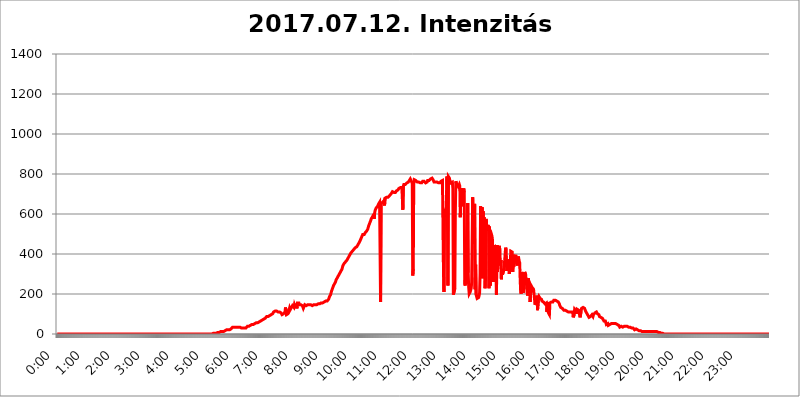
| Category | 2017.07.12. Intenzitás [W/m^2] |
|---|---|
| 0.0 | 0 |
| 0.0006944444444444445 | 0 |
| 0.001388888888888889 | 0 |
| 0.0020833333333333333 | 0 |
| 0.002777777777777778 | 0 |
| 0.003472222222222222 | 0 |
| 0.004166666666666667 | 0 |
| 0.004861111111111111 | 0 |
| 0.005555555555555556 | 0 |
| 0.0062499999999999995 | 0 |
| 0.006944444444444444 | 0 |
| 0.007638888888888889 | 0 |
| 0.008333333333333333 | 0 |
| 0.009027777777777779 | 0 |
| 0.009722222222222222 | 0 |
| 0.010416666666666666 | 0 |
| 0.011111111111111112 | 0 |
| 0.011805555555555555 | 0 |
| 0.012499999999999999 | 0 |
| 0.013194444444444444 | 0 |
| 0.013888888888888888 | 0 |
| 0.014583333333333332 | 0 |
| 0.015277777777777777 | 0 |
| 0.015972222222222224 | 0 |
| 0.016666666666666666 | 0 |
| 0.017361111111111112 | 0 |
| 0.018055555555555557 | 0 |
| 0.01875 | 0 |
| 0.019444444444444445 | 0 |
| 0.02013888888888889 | 0 |
| 0.020833333333333332 | 0 |
| 0.02152777777777778 | 0 |
| 0.022222222222222223 | 0 |
| 0.02291666666666667 | 0 |
| 0.02361111111111111 | 0 |
| 0.024305555555555556 | 0 |
| 0.024999999999999998 | 0 |
| 0.025694444444444447 | 0 |
| 0.02638888888888889 | 0 |
| 0.027083333333333334 | 0 |
| 0.027777777777777776 | 0 |
| 0.02847222222222222 | 0 |
| 0.029166666666666664 | 0 |
| 0.029861111111111113 | 0 |
| 0.030555555555555555 | 0 |
| 0.03125 | 0 |
| 0.03194444444444445 | 0 |
| 0.03263888888888889 | 0 |
| 0.03333333333333333 | 0 |
| 0.034027777777777775 | 0 |
| 0.034722222222222224 | 0 |
| 0.035416666666666666 | 0 |
| 0.036111111111111115 | 0 |
| 0.03680555555555556 | 0 |
| 0.0375 | 0 |
| 0.03819444444444444 | 0 |
| 0.03888888888888889 | 0 |
| 0.03958333333333333 | 0 |
| 0.04027777777777778 | 0 |
| 0.04097222222222222 | 0 |
| 0.041666666666666664 | 0 |
| 0.042361111111111106 | 0 |
| 0.04305555555555556 | 0 |
| 0.043750000000000004 | 0 |
| 0.044444444444444446 | 0 |
| 0.04513888888888889 | 0 |
| 0.04583333333333334 | 0 |
| 0.04652777777777778 | 0 |
| 0.04722222222222222 | 0 |
| 0.04791666666666666 | 0 |
| 0.04861111111111111 | 0 |
| 0.049305555555555554 | 0 |
| 0.049999999999999996 | 0 |
| 0.05069444444444445 | 0 |
| 0.051388888888888894 | 0 |
| 0.052083333333333336 | 0 |
| 0.05277777777777778 | 0 |
| 0.05347222222222222 | 0 |
| 0.05416666666666667 | 0 |
| 0.05486111111111111 | 0 |
| 0.05555555555555555 | 0 |
| 0.05625 | 0 |
| 0.05694444444444444 | 0 |
| 0.057638888888888885 | 0 |
| 0.05833333333333333 | 0 |
| 0.05902777777777778 | 0 |
| 0.059722222222222225 | 0 |
| 0.06041666666666667 | 0 |
| 0.061111111111111116 | 0 |
| 0.06180555555555556 | 0 |
| 0.0625 | 0 |
| 0.06319444444444444 | 0 |
| 0.06388888888888888 | 0 |
| 0.06458333333333334 | 0 |
| 0.06527777777777778 | 0 |
| 0.06597222222222222 | 0 |
| 0.06666666666666667 | 0 |
| 0.06736111111111111 | 0 |
| 0.06805555555555555 | 0 |
| 0.06874999999999999 | 0 |
| 0.06944444444444443 | 0 |
| 0.07013888888888889 | 0 |
| 0.07083333333333333 | 0 |
| 0.07152777777777779 | 0 |
| 0.07222222222222223 | 0 |
| 0.07291666666666667 | 0 |
| 0.07361111111111111 | 0 |
| 0.07430555555555556 | 0 |
| 0.075 | 0 |
| 0.07569444444444444 | 0 |
| 0.0763888888888889 | 0 |
| 0.07708333333333334 | 0 |
| 0.07777777777777778 | 0 |
| 0.07847222222222222 | 0 |
| 0.07916666666666666 | 0 |
| 0.0798611111111111 | 0 |
| 0.08055555555555556 | 0 |
| 0.08125 | 0 |
| 0.08194444444444444 | 0 |
| 0.08263888888888889 | 0 |
| 0.08333333333333333 | 0 |
| 0.08402777777777777 | 0 |
| 0.08472222222222221 | 0 |
| 0.08541666666666665 | 0 |
| 0.08611111111111112 | 0 |
| 0.08680555555555557 | 0 |
| 0.08750000000000001 | 0 |
| 0.08819444444444445 | 0 |
| 0.08888888888888889 | 0 |
| 0.08958333333333333 | 0 |
| 0.09027777777777778 | 0 |
| 0.09097222222222222 | 0 |
| 0.09166666666666667 | 0 |
| 0.09236111111111112 | 0 |
| 0.09305555555555556 | 0 |
| 0.09375 | 0 |
| 0.09444444444444444 | 0 |
| 0.09513888888888888 | 0 |
| 0.09583333333333333 | 0 |
| 0.09652777777777777 | 0 |
| 0.09722222222222222 | 0 |
| 0.09791666666666667 | 0 |
| 0.09861111111111111 | 0 |
| 0.09930555555555555 | 0 |
| 0.09999999999999999 | 0 |
| 0.10069444444444443 | 0 |
| 0.1013888888888889 | 0 |
| 0.10208333333333335 | 0 |
| 0.10277777777777779 | 0 |
| 0.10347222222222223 | 0 |
| 0.10416666666666667 | 0 |
| 0.10486111111111111 | 0 |
| 0.10555555555555556 | 0 |
| 0.10625 | 0 |
| 0.10694444444444444 | 0 |
| 0.1076388888888889 | 0 |
| 0.10833333333333334 | 0 |
| 0.10902777777777778 | 0 |
| 0.10972222222222222 | 0 |
| 0.1111111111111111 | 0 |
| 0.11180555555555556 | 0 |
| 0.11180555555555556 | 0 |
| 0.1125 | 0 |
| 0.11319444444444444 | 0 |
| 0.11388888888888889 | 0 |
| 0.11458333333333333 | 0 |
| 0.11527777777777777 | 0 |
| 0.11597222222222221 | 0 |
| 0.11666666666666665 | 0 |
| 0.1173611111111111 | 0 |
| 0.11805555555555557 | 0 |
| 0.11944444444444445 | 0 |
| 0.12013888888888889 | 0 |
| 0.12083333333333333 | 0 |
| 0.12152777777777778 | 0 |
| 0.12222222222222223 | 0 |
| 0.12291666666666667 | 0 |
| 0.12291666666666667 | 0 |
| 0.12361111111111112 | 0 |
| 0.12430555555555556 | 0 |
| 0.125 | 0 |
| 0.12569444444444444 | 0 |
| 0.12638888888888888 | 0 |
| 0.12708333333333333 | 0 |
| 0.16875 | 0 |
| 0.12847222222222224 | 0 |
| 0.12916666666666668 | 0 |
| 0.12986111111111112 | 0 |
| 0.13055555555555556 | 0 |
| 0.13125 | 0 |
| 0.13194444444444445 | 0 |
| 0.1326388888888889 | 0 |
| 0.13333333333333333 | 0 |
| 0.13402777777777777 | 0 |
| 0.13402777777777777 | 0 |
| 0.13472222222222222 | 0 |
| 0.13541666666666666 | 0 |
| 0.1361111111111111 | 0 |
| 0.13749999999999998 | 0 |
| 0.13819444444444443 | 0 |
| 0.1388888888888889 | 0 |
| 0.13958333333333334 | 0 |
| 0.14027777777777778 | 0 |
| 0.14097222222222222 | 0 |
| 0.14166666666666666 | 0 |
| 0.1423611111111111 | 0 |
| 0.14305555555555557 | 0 |
| 0.14375000000000002 | 0 |
| 0.14444444444444446 | 0 |
| 0.1451388888888889 | 0 |
| 0.1451388888888889 | 0 |
| 0.14652777777777778 | 0 |
| 0.14722222222222223 | 0 |
| 0.14791666666666667 | 0 |
| 0.1486111111111111 | 0 |
| 0.14930555555555555 | 0 |
| 0.15 | 0 |
| 0.15069444444444444 | 0 |
| 0.15138888888888888 | 0 |
| 0.15208333333333332 | 0 |
| 0.15277777777777776 | 0 |
| 0.15347222222222223 | 0 |
| 0.15416666666666667 | 0 |
| 0.15486111111111112 | 0 |
| 0.15555555555555556 | 0 |
| 0.15625 | 0 |
| 0.15694444444444444 | 0 |
| 0.15763888888888888 | 0 |
| 0.15833333333333333 | 0 |
| 0.15902777777777777 | 0 |
| 0.15972222222222224 | 0 |
| 0.16041666666666668 | 0 |
| 0.16111111111111112 | 0 |
| 0.16180555555555556 | 0 |
| 0.1625 | 0 |
| 0.16319444444444445 | 0 |
| 0.1638888888888889 | 0 |
| 0.16458333333333333 | 0 |
| 0.16527777777777777 | 0 |
| 0.16597222222222222 | 0 |
| 0.16666666666666666 | 0 |
| 0.1673611111111111 | 0 |
| 0.16805555555555554 | 0 |
| 0.16874999999999998 | 0 |
| 0.16944444444444443 | 0 |
| 0.17013888888888887 | 0 |
| 0.1708333333333333 | 0 |
| 0.17152777777777775 | 0 |
| 0.17222222222222225 | 0 |
| 0.1729166666666667 | 0 |
| 0.17361111111111113 | 0 |
| 0.17430555555555557 | 0 |
| 0.17500000000000002 | 0 |
| 0.17569444444444446 | 0 |
| 0.1763888888888889 | 0 |
| 0.17708333333333334 | 0 |
| 0.17777777777777778 | 0 |
| 0.17847222222222223 | 0 |
| 0.17916666666666667 | 0 |
| 0.1798611111111111 | 0 |
| 0.18055555555555555 | 0 |
| 0.18125 | 0 |
| 0.18194444444444444 | 0 |
| 0.1826388888888889 | 0 |
| 0.18333333333333335 | 0 |
| 0.1840277777777778 | 0 |
| 0.18472222222222223 | 0 |
| 0.18541666666666667 | 0 |
| 0.18611111111111112 | 0 |
| 0.18680555555555556 | 0 |
| 0.1875 | 0 |
| 0.18819444444444444 | 0 |
| 0.18888888888888888 | 0 |
| 0.18958333333333333 | 0 |
| 0.19027777777777777 | 0 |
| 0.1909722222222222 | 0 |
| 0.19166666666666665 | 0 |
| 0.19236111111111112 | 0 |
| 0.19305555555555554 | 0 |
| 0.19375 | 0 |
| 0.19444444444444445 | 0 |
| 0.1951388888888889 | 0 |
| 0.19583333333333333 | 0 |
| 0.19652777777777777 | 0 |
| 0.19722222222222222 | 0 |
| 0.19791666666666666 | 0 |
| 0.1986111111111111 | 0 |
| 0.19930555555555554 | 0 |
| 0.19999999999999998 | 0 |
| 0.20069444444444443 | 0 |
| 0.20138888888888887 | 0 |
| 0.2020833333333333 | 0 |
| 0.2027777777777778 | 0 |
| 0.2034722222222222 | 0 |
| 0.2041666666666667 | 0 |
| 0.20486111111111113 | 0 |
| 0.20555555555555557 | 0 |
| 0.20625000000000002 | 0 |
| 0.20694444444444446 | 0 |
| 0.2076388888888889 | 0 |
| 0.20833333333333334 | 0 |
| 0.20902777777777778 | 0 |
| 0.20972222222222223 | 0 |
| 0.21041666666666667 | 0 |
| 0.2111111111111111 | 0 |
| 0.21180555555555555 | 0 |
| 0.2125 | 0 |
| 0.21319444444444444 | 0 |
| 0.2138888888888889 | 0 |
| 0.21458333333333335 | 0 |
| 0.2152777777777778 | 0 |
| 0.21597222222222223 | 0 |
| 0.21666666666666667 | 0 |
| 0.21736111111111112 | 0 |
| 0.21805555555555556 | 3.525 |
| 0.21875 | 3.525 |
| 0.21944444444444444 | 3.525 |
| 0.22013888888888888 | 3.525 |
| 0.22083333333333333 | 3.525 |
| 0.22152777777777777 | 3.525 |
| 0.2222222222222222 | 3.525 |
| 0.22291666666666665 | 3.525 |
| 0.2236111111111111 | 7.887 |
| 0.22430555555555556 | 7.887 |
| 0.225 | 7.887 |
| 0.22569444444444445 | 7.887 |
| 0.2263888888888889 | 7.887 |
| 0.22708333333333333 | 7.887 |
| 0.22777777777777777 | 7.887 |
| 0.22847222222222222 | 7.887 |
| 0.22916666666666666 | 12.257 |
| 0.2298611111111111 | 12.257 |
| 0.23055555555555554 | 12.257 |
| 0.23124999999999998 | 12.257 |
| 0.23194444444444443 | 12.257 |
| 0.23263888888888887 | 12.257 |
| 0.2333333333333333 | 12.257 |
| 0.2340277777777778 | 16.636 |
| 0.2347222222222222 | 16.636 |
| 0.2354166666666667 | 16.636 |
| 0.23611111111111113 | 16.636 |
| 0.23680555555555557 | 16.636 |
| 0.23750000000000002 | 21.024 |
| 0.23819444444444446 | 21.024 |
| 0.2388888888888889 | 21.024 |
| 0.23958333333333334 | 21.024 |
| 0.24027777777777778 | 21.024 |
| 0.24097222222222223 | 21.024 |
| 0.24166666666666667 | 21.024 |
| 0.2423611111111111 | 25.419 |
| 0.24305555555555555 | 25.419 |
| 0.24375 | 25.419 |
| 0.24444444444444446 | 29.823 |
| 0.24513888888888888 | 29.823 |
| 0.24583333333333335 | 34.234 |
| 0.2465277777777778 | 34.234 |
| 0.24722222222222223 | 34.234 |
| 0.24791666666666667 | 34.234 |
| 0.24861111111111112 | 34.234 |
| 0.24930555555555556 | 34.234 |
| 0.25 | 34.234 |
| 0.25069444444444444 | 34.234 |
| 0.2513888888888889 | 34.234 |
| 0.2520833333333333 | 34.234 |
| 0.25277777777777777 | 34.234 |
| 0.2534722222222222 | 34.234 |
| 0.25416666666666665 | 34.234 |
| 0.2548611111111111 | 34.234 |
| 0.2555555555555556 | 34.234 |
| 0.25625000000000003 | 34.234 |
| 0.2569444444444445 | 34.234 |
| 0.2576388888888889 | 29.823 |
| 0.25833333333333336 | 29.823 |
| 0.2590277777777778 | 29.823 |
| 0.25972222222222224 | 29.823 |
| 0.2604166666666667 | 29.823 |
| 0.2611111111111111 | 29.823 |
| 0.26180555555555557 | 29.823 |
| 0.2625 | 29.823 |
| 0.26319444444444445 | 29.823 |
| 0.2638888888888889 | 29.823 |
| 0.26458333333333334 | 29.823 |
| 0.2652777777777778 | 34.234 |
| 0.2659722222222222 | 34.234 |
| 0.26666666666666666 | 38.653 |
| 0.2673611111111111 | 38.653 |
| 0.26805555555555555 | 38.653 |
| 0.26875 | 38.653 |
| 0.26944444444444443 | 43.079 |
| 0.2701388888888889 | 43.079 |
| 0.2708333333333333 | 43.079 |
| 0.27152777777777776 | 43.079 |
| 0.2722222222222222 | 47.511 |
| 0.27291666666666664 | 47.511 |
| 0.2736111111111111 | 47.511 |
| 0.2743055555555555 | 47.511 |
| 0.27499999999999997 | 47.511 |
| 0.27569444444444446 | 47.511 |
| 0.27638888888888885 | 51.951 |
| 0.27708333333333335 | 51.951 |
| 0.2777777777777778 | 51.951 |
| 0.27847222222222223 | 51.951 |
| 0.2791666666666667 | 56.398 |
| 0.2798611111111111 | 56.398 |
| 0.28055555555555556 | 56.398 |
| 0.28125 | 56.398 |
| 0.28194444444444444 | 56.398 |
| 0.2826388888888889 | 56.398 |
| 0.2833333333333333 | 60.85 |
| 0.28402777777777777 | 60.85 |
| 0.2847222222222222 | 65.31 |
| 0.28541666666666665 | 65.31 |
| 0.28611111111111115 | 65.31 |
| 0.28680555555555554 | 69.775 |
| 0.28750000000000003 | 69.775 |
| 0.2881944444444445 | 69.775 |
| 0.2888888888888889 | 74.246 |
| 0.28958333333333336 | 74.246 |
| 0.2902777777777778 | 74.246 |
| 0.29097222222222224 | 78.722 |
| 0.2916666666666667 | 78.722 |
| 0.2923611111111111 | 83.205 |
| 0.29305555555555557 | 83.205 |
| 0.29375 | 87.692 |
| 0.29444444444444445 | 87.692 |
| 0.2951388888888889 | 87.692 |
| 0.29583333333333334 | 87.692 |
| 0.2965277777777778 | 87.692 |
| 0.2972222222222222 | 92.184 |
| 0.29791666666666666 | 92.184 |
| 0.2986111111111111 | 96.682 |
| 0.29930555555555555 | 96.682 |
| 0.3 | 96.682 |
| 0.30069444444444443 | 101.184 |
| 0.3013888888888889 | 101.184 |
| 0.3020833333333333 | 101.184 |
| 0.30277777777777776 | 105.69 |
| 0.3034722222222222 | 110.201 |
| 0.30416666666666664 | 114.716 |
| 0.3048611111111111 | 114.716 |
| 0.3055555555555555 | 114.716 |
| 0.30624999999999997 | 114.716 |
| 0.3069444444444444 | 114.716 |
| 0.3076388888888889 | 114.716 |
| 0.30833333333333335 | 110.201 |
| 0.3090277777777778 | 110.201 |
| 0.30972222222222223 | 110.201 |
| 0.3104166666666667 | 110.201 |
| 0.3111111111111111 | 110.201 |
| 0.31180555555555556 | 110.201 |
| 0.3125 | 110.201 |
| 0.31319444444444444 | 110.201 |
| 0.3138888888888889 | 105.69 |
| 0.3145833333333333 | 101.184 |
| 0.31527777777777777 | 96.682 |
| 0.3159722222222222 | 96.682 |
| 0.31666666666666665 | 96.682 |
| 0.31736111111111115 | 101.184 |
| 0.31805555555555554 | 96.682 |
| 0.31875000000000003 | 105.69 |
| 0.3194444444444445 | 110.201 |
| 0.3201388888888889 | 132.814 |
| 0.32083333333333336 | 119.235 |
| 0.3215277777777778 | 96.682 |
| 0.32222222222222224 | 96.682 |
| 0.3229166666666667 | 101.184 |
| 0.3236111111111111 | 101.184 |
| 0.32430555555555557 | 101.184 |
| 0.325 | 105.69 |
| 0.32569444444444445 | 128.284 |
| 0.3263888888888889 | 119.235 |
| 0.32708333333333334 | 119.235 |
| 0.3277777777777778 | 119.235 |
| 0.3284722222222222 | 132.814 |
| 0.32916666666666666 | 137.347 |
| 0.3298611111111111 | 141.884 |
| 0.33055555555555555 | 141.884 |
| 0.33125 | 141.884 |
| 0.33194444444444443 | 132.814 |
| 0.3326388888888889 | 146.423 |
| 0.3333333333333333 | 150.964 |
| 0.3340277777777778 | 132.814 |
| 0.3347222222222222 | 150.964 |
| 0.3354166666666667 | 155.509 |
| 0.3361111111111111 | 128.284 |
| 0.3368055555555556 | 155.509 |
| 0.33749999999999997 | 155.509 |
| 0.33819444444444446 | 150.964 |
| 0.33888888888888885 | 155.509 |
| 0.33958333333333335 | 146.423 |
| 0.34027777777777773 | 146.423 |
| 0.34097222222222223 | 146.423 |
| 0.3416666666666666 | 146.423 |
| 0.3423611111111111 | 141.884 |
| 0.3430555555555555 | 141.884 |
| 0.34375 | 141.884 |
| 0.3444444444444445 | 141.884 |
| 0.3451388888888889 | 128.284 |
| 0.3458333333333334 | 123.758 |
| 0.34652777777777777 | 128.284 |
| 0.34722222222222227 | 146.423 |
| 0.34791666666666665 | 146.423 |
| 0.34861111111111115 | 141.884 |
| 0.34930555555555554 | 141.884 |
| 0.35000000000000003 | 137.347 |
| 0.3506944444444444 | 141.884 |
| 0.3513888888888889 | 146.423 |
| 0.3520833333333333 | 146.423 |
| 0.3527777777777778 | 146.423 |
| 0.3534722222222222 | 146.423 |
| 0.3541666666666667 | 146.423 |
| 0.3548611111111111 | 146.423 |
| 0.35555555555555557 | 146.423 |
| 0.35625 | 141.884 |
| 0.35694444444444445 | 141.884 |
| 0.3576388888888889 | 141.884 |
| 0.35833333333333334 | 146.423 |
| 0.3590277777777778 | 141.884 |
| 0.3597222222222222 | 146.423 |
| 0.36041666666666666 | 146.423 |
| 0.3611111111111111 | 146.423 |
| 0.36180555555555555 | 146.423 |
| 0.3625 | 146.423 |
| 0.36319444444444443 | 146.423 |
| 0.3638888888888889 | 146.423 |
| 0.3645833333333333 | 146.423 |
| 0.3652777777777778 | 150.964 |
| 0.3659722222222222 | 150.964 |
| 0.3666666666666667 | 150.964 |
| 0.3673611111111111 | 150.964 |
| 0.3680555555555556 | 150.964 |
| 0.36874999999999997 | 155.509 |
| 0.36944444444444446 | 155.509 |
| 0.37013888888888885 | 155.509 |
| 0.37083333333333335 | 155.509 |
| 0.37152777777777773 | 155.509 |
| 0.37222222222222223 | 155.509 |
| 0.3729166666666666 | 160.056 |
| 0.3736111111111111 | 160.056 |
| 0.3743055555555555 | 160.056 |
| 0.375 | 160.056 |
| 0.3756944444444445 | 160.056 |
| 0.3763888888888889 | 164.605 |
| 0.3770833333333334 | 164.605 |
| 0.37777777777777777 | 164.605 |
| 0.37847222222222227 | 164.605 |
| 0.37916666666666665 | 164.605 |
| 0.37986111111111115 | 164.605 |
| 0.38055555555555554 | 173.709 |
| 0.38125000000000003 | 178.264 |
| 0.3819444444444444 | 187.378 |
| 0.3826388888888889 | 191.937 |
| 0.3833333333333333 | 196.497 |
| 0.3840277777777778 | 205.62 |
| 0.3847222222222222 | 214.746 |
| 0.3854166666666667 | 219.309 |
| 0.3861111111111111 | 228.436 |
| 0.38680555555555557 | 233 |
| 0.3875 | 242.127 |
| 0.38819444444444445 | 246.689 |
| 0.3888888888888889 | 251.251 |
| 0.38958333333333334 | 255.813 |
| 0.3902777777777778 | 260.373 |
| 0.3909722222222222 | 269.49 |
| 0.39166666666666666 | 274.047 |
| 0.3923611111111111 | 278.603 |
| 0.39305555555555555 | 278.603 |
| 0.39375 | 287.709 |
| 0.39444444444444443 | 287.709 |
| 0.3951388888888889 | 296.808 |
| 0.3958333333333333 | 301.354 |
| 0.3965277777777778 | 305.898 |
| 0.3972222222222222 | 310.44 |
| 0.3979166666666667 | 314.98 |
| 0.3986111111111111 | 319.517 |
| 0.3993055555555556 | 324.052 |
| 0.39999999999999997 | 333.113 |
| 0.40069444444444446 | 342.162 |
| 0.40138888888888885 | 346.682 |
| 0.40208333333333335 | 351.198 |
| 0.40277777777777773 | 351.198 |
| 0.40347222222222223 | 355.712 |
| 0.4041666666666666 | 360.221 |
| 0.4048611111111111 | 360.221 |
| 0.4055555555555555 | 364.728 |
| 0.40625 | 369.23 |
| 0.4069444444444445 | 373.729 |
| 0.4076388888888889 | 378.224 |
| 0.4083333333333334 | 382.715 |
| 0.40902777777777777 | 387.202 |
| 0.40972222222222227 | 391.685 |
| 0.41041666666666665 | 396.164 |
| 0.41111111111111115 | 400.638 |
| 0.41180555555555554 | 405.108 |
| 0.41250000000000003 | 405.108 |
| 0.4131944444444444 | 409.574 |
| 0.4138888888888889 | 414.035 |
| 0.4145833333333333 | 418.492 |
| 0.4152777777777778 | 418.492 |
| 0.4159722222222222 | 422.943 |
| 0.4166666666666667 | 422.943 |
| 0.4173611111111111 | 427.39 |
| 0.41805555555555557 | 431.833 |
| 0.41875 | 431.833 |
| 0.41944444444444445 | 431.833 |
| 0.4201388888888889 | 436.27 |
| 0.42083333333333334 | 440.702 |
| 0.4215277777777778 | 445.129 |
| 0.4222222222222222 | 449.551 |
| 0.42291666666666666 | 453.968 |
| 0.4236111111111111 | 453.968 |
| 0.42430555555555555 | 462.786 |
| 0.425 | 467.187 |
| 0.42569444444444443 | 467.187 |
| 0.4263888888888889 | 480.356 |
| 0.4270833333333333 | 480.356 |
| 0.4277777777777778 | 484.735 |
| 0.4284722222222222 | 497.836 |
| 0.4291666666666667 | 497.836 |
| 0.4298611111111111 | 497.836 |
| 0.4305555555555556 | 497.836 |
| 0.43124999999999997 | 502.192 |
| 0.43194444444444446 | 506.542 |
| 0.43263888888888885 | 510.885 |
| 0.43333333333333335 | 502.192 |
| 0.43402777777777773 | 515.223 |
| 0.43472222222222223 | 515.223 |
| 0.4354166666666666 | 523.88 |
| 0.4361111111111111 | 532.513 |
| 0.4368055555555555 | 541.121 |
| 0.4375 | 545.416 |
| 0.4381944444444445 | 553.986 |
| 0.4388888888888889 | 558.261 |
| 0.4395833333333334 | 566.793 |
| 0.44027777777777777 | 575.299 |
| 0.44097222222222227 | 571.049 |
| 0.44166666666666665 | 583.779 |
| 0.44236111111111115 | 588.009 |
| 0.44305555555555554 | 592.233 |
| 0.44375000000000003 | 600.661 |
| 0.4444444444444444 | 575.299 |
| 0.4451388888888889 | 604.864 |
| 0.4458333333333333 | 617.436 |
| 0.4465277777777778 | 621.613 |
| 0.4472222222222222 | 629.948 |
| 0.4479166666666667 | 629.948 |
| 0.4486111111111111 | 634.105 |
| 0.44930555555555557 | 638.256 |
| 0.45 | 642.4 |
| 0.45069444444444445 | 650.667 |
| 0.4513888888888889 | 654.791 |
| 0.45208333333333334 | 658.909 |
| 0.4527777777777778 | 658.909 |
| 0.4534722222222222 | 160.056 |
| 0.45416666666666666 | 654.791 |
| 0.4548611111111111 | 654.791 |
| 0.45555555555555555 | 658.909 |
| 0.45625 | 658.909 |
| 0.45694444444444443 | 658.909 |
| 0.4576388888888889 | 663.019 |
| 0.4583333333333333 | 667.123 |
| 0.4590277777777778 | 642.4 |
| 0.4597222222222222 | 679.395 |
| 0.4604166666666667 | 679.395 |
| 0.4611111111111111 | 679.395 |
| 0.4618055555555556 | 683.473 |
| 0.46249999999999997 | 683.473 |
| 0.46319444444444446 | 683.473 |
| 0.46388888888888885 | 683.473 |
| 0.46458333333333335 | 683.473 |
| 0.46527777777777773 | 687.544 |
| 0.46597222222222223 | 691.608 |
| 0.4666666666666666 | 691.608 |
| 0.4673611111111111 | 695.666 |
| 0.4680555555555555 | 699.717 |
| 0.46875 | 703.762 |
| 0.4694444444444445 | 703.762 |
| 0.4701388888888889 | 711.832 |
| 0.4708333333333334 | 707.8 |
| 0.47152777777777777 | 707.8 |
| 0.47222222222222227 | 707.8 |
| 0.47291666666666665 | 703.762 |
| 0.47361111111111115 | 707.8 |
| 0.47430555555555554 | 707.8 |
| 0.47500000000000003 | 711.832 |
| 0.4756944444444444 | 715.858 |
| 0.4763888888888889 | 715.858 |
| 0.4770833333333333 | 715.858 |
| 0.4777777777777778 | 719.877 |
| 0.4784722222222222 | 719.877 |
| 0.4791666666666667 | 727.896 |
| 0.4798611111111111 | 727.896 |
| 0.48055555555555557 | 727.896 |
| 0.48125 | 731.896 |
| 0.48194444444444445 | 735.89 |
| 0.4826388888888889 | 727.896 |
| 0.48333333333333334 | 731.896 |
| 0.4840277777777778 | 731.896 |
| 0.4847222222222222 | 621.613 |
| 0.48541666666666666 | 739.877 |
| 0.4861111111111111 | 747.834 |
| 0.48680555555555555 | 747.834 |
| 0.4875 | 743.859 |
| 0.48819444444444443 | 747.834 |
| 0.4888888888888889 | 747.834 |
| 0.4895833333333333 | 751.803 |
| 0.4902777777777778 | 755.766 |
| 0.4909722222222222 | 755.766 |
| 0.4916666666666667 | 759.723 |
| 0.4923611111111111 | 759.723 |
| 0.4930555555555556 | 763.674 |
| 0.49374999999999997 | 767.62 |
| 0.49444444444444446 | 771.559 |
| 0.49513888888888885 | 775.492 |
| 0.49583333333333335 | 771.559 |
| 0.49652777777777773 | 771.559 |
| 0.49722222222222223 | 759.723 |
| 0.4979166666666666 | 751.803 |
| 0.4986111111111111 | 292.259 |
| 0.4993055555555555 | 324.052 |
| 0.5 | 747.834 |
| 0.5006944444444444 | 771.559 |
| 0.5013888888888889 | 767.62 |
| 0.5020833333333333 | 767.62 |
| 0.5027777777777778 | 767.62 |
| 0.5034722222222222 | 763.674 |
| 0.5041666666666667 | 763.674 |
| 0.5048611111111111 | 759.723 |
| 0.5055555555555555 | 763.674 |
| 0.50625 | 759.723 |
| 0.5069444444444444 | 759.723 |
| 0.5076388888888889 | 759.723 |
| 0.5083333333333333 | 755.766 |
| 0.5090277777777777 | 755.766 |
| 0.5097222222222222 | 759.723 |
| 0.5104166666666666 | 751.803 |
| 0.5111111111111112 | 755.766 |
| 0.5118055555555555 | 759.723 |
| 0.5125000000000001 | 763.674 |
| 0.5131944444444444 | 767.62 |
| 0.513888888888889 | 767.62 |
| 0.5145833333333333 | 763.674 |
| 0.5152777777777778 | 763.674 |
| 0.5159722222222222 | 759.723 |
| 0.5166666666666667 | 755.766 |
| 0.517361111111111 | 759.723 |
| 0.5180555555555556 | 759.723 |
| 0.5187499999999999 | 759.723 |
| 0.5194444444444445 | 767.62 |
| 0.5201388888888888 | 767.62 |
| 0.5208333333333334 | 767.62 |
| 0.5215277777777778 | 767.62 |
| 0.5222222222222223 | 767.62 |
| 0.5229166666666667 | 767.62 |
| 0.5236111111111111 | 775.492 |
| 0.5243055555555556 | 775.492 |
| 0.525 | 775.492 |
| 0.5256944444444445 | 779.42 |
| 0.5263888888888889 | 775.492 |
| 0.5270833333333333 | 771.559 |
| 0.5277777777777778 | 767.62 |
| 0.5284722222222222 | 759.723 |
| 0.5291666666666667 | 759.723 |
| 0.5298611111111111 | 759.723 |
| 0.5305555555555556 | 759.723 |
| 0.53125 | 759.723 |
| 0.5319444444444444 | 759.723 |
| 0.5326388888888889 | 759.723 |
| 0.5333333333333333 | 755.766 |
| 0.5340277777777778 | 755.766 |
| 0.5347222222222222 | 755.766 |
| 0.5354166666666667 | 751.803 |
| 0.5361111111111111 | 755.766 |
| 0.5368055555555555 | 755.766 |
| 0.5375 | 759.723 |
| 0.5381944444444444 | 763.674 |
| 0.5388888888888889 | 767.62 |
| 0.5395833333333333 | 763.674 |
| 0.5402777777777777 | 767.62 |
| 0.5409722222222222 | 767.62 |
| 0.5416666666666666 | 324.052 |
| 0.5423611111111112 | 210.182 |
| 0.5430555555555555 | 600.661 |
| 0.5437500000000001 | 625.784 |
| 0.5444444444444444 | 583.779 |
| 0.545138888888889 | 609.062 |
| 0.5458333333333333 | 671.22 |
| 0.5465277777777778 | 787.258 |
| 0.5472222222222222 | 600.661 |
| 0.5479166666666667 | 242.127 |
| 0.548611111111111 | 787.258 |
| 0.5493055555555556 | 783.342 |
| 0.5499999999999999 | 779.42 |
| 0.5506944444444445 | 767.62 |
| 0.5513888888888888 | 767.62 |
| 0.5520833333333334 | 755.766 |
| 0.5527777777777778 | 755.766 |
| 0.5534722222222223 | 759.723 |
| 0.5541666666666667 | 759.723 |
| 0.5548611111111111 | 727.896 |
| 0.5555555555555556 | 196.497 |
| 0.55625 | 191.937 |
| 0.5569444444444445 | 201.058 |
| 0.5576388888888889 | 228.436 |
| 0.5583333333333333 | 609.062 |
| 0.5590277777777778 | 763.674 |
| 0.5597222222222222 | 755.766 |
| 0.5604166666666667 | 755.766 |
| 0.5611111111111111 | 743.859 |
| 0.5618055555555556 | 739.877 |
| 0.5625 | 735.89 |
| 0.5631944444444444 | 739.877 |
| 0.5638888888888889 | 747.834 |
| 0.5645833333333333 | 739.877 |
| 0.5652777777777778 | 583.779 |
| 0.5659722222222222 | 695.666 |
| 0.5666666666666667 | 727.896 |
| 0.5673611111111111 | 719.877 |
| 0.5680555555555555 | 727.896 |
| 0.56875 | 638.256 |
| 0.5694444444444444 | 715.858 |
| 0.5701388888888889 | 727.896 |
| 0.5708333333333333 | 707.8 |
| 0.5715277777777777 | 251.251 |
| 0.5722222222222222 | 242.127 |
| 0.5729166666666666 | 342.162 |
| 0.5736111111111112 | 260.373 |
| 0.5743055555555555 | 251.251 |
| 0.5750000000000001 | 342.162 |
| 0.5756944444444444 | 654.791 |
| 0.576388888888889 | 305.898 |
| 0.5770833333333333 | 233 |
| 0.5777777777777778 | 201.058 |
| 0.5784722222222222 | 205.62 |
| 0.5791666666666667 | 210.182 |
| 0.579861111111111 | 214.746 |
| 0.5805555555555556 | 228.436 |
| 0.5812499999999999 | 255.813 |
| 0.5819444444444445 | 255.813 |
| 0.5826388888888888 | 683.473 |
| 0.5833333333333334 | 683.473 |
| 0.5840277777777778 | 449.551 |
| 0.5847222222222223 | 497.836 |
| 0.5854166666666667 | 650.667 |
| 0.5861111111111111 | 223.873 |
| 0.5868055555555556 | 346.682 |
| 0.5875 | 196.497 |
| 0.5881944444444445 | 191.937 |
| 0.5888888888888889 | 178.264 |
| 0.5895833333333333 | 173.709 |
| 0.5902777777777778 | 182.82 |
| 0.5909722222222222 | 182.82 |
| 0.5916666666666667 | 191.937 |
| 0.5923611111111111 | 205.62 |
| 0.5930555555555556 | 301.354 |
| 0.59375 | 638.256 |
| 0.5944444444444444 | 287.709 |
| 0.5951388888888889 | 283.156 |
| 0.5958333333333333 | 634.105 |
| 0.5965277777777778 | 278.603 |
| 0.5972222222222222 | 613.252 |
| 0.5979166666666667 | 337.639 |
| 0.5986111111111111 | 583.779 |
| 0.5993055555555555 | 328.584 |
| 0.6 | 228.436 |
| 0.6006944444444444 | 283.156 |
| 0.6013888888888889 | 575.299 |
| 0.6020833333333333 | 558.261 |
| 0.6027777777777777 | 515.223 |
| 0.6034722222222222 | 528.2 |
| 0.6041666666666666 | 545.416 |
| 0.6048611111111112 | 532.513 |
| 0.6055555555555555 | 228.436 |
| 0.6062500000000001 | 536.82 |
| 0.6069444444444444 | 242.127 |
| 0.607638888888889 | 251.251 |
| 0.6083333333333333 | 489.108 |
| 0.6090277777777778 | 497.836 |
| 0.6097222222222222 | 489.108 |
| 0.6104166666666667 | 471.582 |
| 0.611111111111111 | 467.187 |
| 0.6118055555555556 | 260.373 |
| 0.6124999999999999 | 355.712 |
| 0.6131944444444445 | 445.129 |
| 0.6138888888888888 | 440.702 |
| 0.6145833333333334 | 431.833 |
| 0.6152777777777778 | 431.833 |
| 0.6159722222222223 | 196.497 |
| 0.6166666666666667 | 445.129 |
| 0.6173611111111111 | 310.44 |
| 0.6180555555555556 | 431.833 |
| 0.61875 | 436.27 |
| 0.6194444444444445 | 409.574 |
| 0.6201388888888889 | 440.702 |
| 0.6208333333333333 | 414.035 |
| 0.6215277777777778 | 342.162 |
| 0.6222222222222222 | 369.23 |
| 0.6229166666666667 | 274.047 |
| 0.6236111111111111 | 324.052 |
| 0.6243055555555556 | 296.808 |
| 0.625 | 292.259 |
| 0.6256944444444444 | 310.44 |
| 0.6263888888888889 | 328.584 |
| 0.6270833333333333 | 346.682 |
| 0.6277777777777778 | 342.162 |
| 0.6284722222222222 | 414.035 |
| 0.6291666666666667 | 431.833 |
| 0.6298611111111111 | 360.221 |
| 0.6305555555555555 | 314.98 |
| 0.63125 | 373.729 |
| 0.6319444444444444 | 346.682 |
| 0.6326388888888889 | 319.517 |
| 0.6333333333333333 | 360.221 |
| 0.6340277777777777 | 301.354 |
| 0.6347222222222222 | 305.898 |
| 0.6354166666666666 | 355.712 |
| 0.6361111111111112 | 414.035 |
| 0.6368055555555555 | 409.574 |
| 0.6375000000000001 | 409.574 |
| 0.6381944444444444 | 409.574 |
| 0.638888888888889 | 310.44 |
| 0.6395833333333333 | 396.164 |
| 0.6402777777777778 | 337.639 |
| 0.6409722222222222 | 337.639 |
| 0.6416666666666667 | 373.729 |
| 0.642361111111111 | 378.224 |
| 0.6430555555555556 | 396.164 |
| 0.6437499999999999 | 369.23 |
| 0.6444444444444445 | 355.712 |
| 0.6451388888888888 | 355.712 |
| 0.6458333333333334 | 342.162 |
| 0.6465277777777778 | 387.202 |
| 0.6472222222222223 | 378.224 |
| 0.6479166666666667 | 364.728 |
| 0.6486111111111111 | 355.712 |
| 0.6493055555555556 | 269.49 |
| 0.65 | 210.182 |
| 0.6506944444444445 | 201.058 |
| 0.6513888888888889 | 310.44 |
| 0.6520833333333333 | 310.44 |
| 0.6527777777777778 | 310.44 |
| 0.6534722222222222 | 205.62 |
| 0.6541666666666667 | 219.309 |
| 0.6548611111111111 | 228.436 |
| 0.6555555555555556 | 310.44 |
| 0.65625 | 305.898 |
| 0.6569444444444444 | 296.808 |
| 0.6576388888888889 | 296.808 |
| 0.6583333333333333 | 242.127 |
| 0.6590277777777778 | 205.62 |
| 0.6597222222222222 | 191.937 |
| 0.6604166666666667 | 278.603 |
| 0.6611111111111111 | 269.49 |
| 0.6618055555555555 | 269.49 |
| 0.6625 | 237.564 |
| 0.6631944444444444 | 160.056 |
| 0.6638888888888889 | 164.605 |
| 0.6645833333333333 | 242.127 |
| 0.6652777777777777 | 242.127 |
| 0.6659722222222222 | 233 |
| 0.6666666666666666 | 233 |
| 0.6673611111111111 | 228.436 |
| 0.6680555555555556 | 223.873 |
| 0.6687500000000001 | 219.309 |
| 0.6694444444444444 | 219.309 |
| 0.6701388888888888 | 146.423 |
| 0.6708333333333334 | 141.884 |
| 0.6715277777777778 | 164.605 |
| 0.6722222222222222 | 160.056 |
| 0.6729166666666666 | 191.937 |
| 0.6736111111111112 | 119.235 |
| 0.6743055555555556 | 119.235 |
| 0.6749999999999999 | 178.264 |
| 0.6756944444444444 | 187.378 |
| 0.6763888888888889 | 182.82 |
| 0.6770833333333334 | 178.264 |
| 0.6777777777777777 | 178.264 |
| 0.6784722222222223 | 173.709 |
| 0.6791666666666667 | 173.709 |
| 0.6798611111111111 | 164.605 |
| 0.6805555555555555 | 164.605 |
| 0.68125 | 164.605 |
| 0.6819444444444445 | 160.056 |
| 0.6826388888888889 | 160.056 |
| 0.6833333333333332 | 155.509 |
| 0.6840277777777778 | 150.964 |
| 0.6847222222222222 | 150.964 |
| 0.6854166666666667 | 155.509 |
| 0.686111111111111 | 155.509 |
| 0.6868055555555556 | 110.201 |
| 0.6875 | 160.056 |
| 0.6881944444444444 | 155.509 |
| 0.688888888888889 | 105.69 |
| 0.6895833333333333 | 101.184 |
| 0.6902777777777778 | 96.682 |
| 0.6909722222222222 | 155.509 |
| 0.6916666666666668 | 160.056 |
| 0.6923611111111111 | 160.056 |
| 0.6930555555555555 | 160.056 |
| 0.69375 | 160.056 |
| 0.6944444444444445 | 160.056 |
| 0.6951388888888889 | 160.056 |
| 0.6958333333333333 | 164.605 |
| 0.6965277777777777 | 169.156 |
| 0.6972222222222223 | 169.156 |
| 0.6979166666666666 | 169.156 |
| 0.6986111111111111 | 169.156 |
| 0.6993055555555556 | 164.605 |
| 0.7000000000000001 | 164.605 |
| 0.7006944444444444 | 164.605 |
| 0.7013888888888888 | 164.605 |
| 0.7020833333333334 | 164.605 |
| 0.7027777777777778 | 160.056 |
| 0.7034722222222222 | 155.509 |
| 0.7041666666666666 | 150.964 |
| 0.7048611111111112 | 141.884 |
| 0.7055555555555556 | 137.347 |
| 0.7062499999999999 | 132.814 |
| 0.7069444444444444 | 132.814 |
| 0.7076388888888889 | 128.284 |
| 0.7083333333333334 | 128.284 |
| 0.7090277777777777 | 128.284 |
| 0.7097222222222223 | 123.758 |
| 0.7104166666666667 | 119.235 |
| 0.7111111111111111 | 119.235 |
| 0.7118055555555555 | 119.235 |
| 0.7125 | 119.235 |
| 0.7131944444444445 | 114.716 |
| 0.7138888888888889 | 114.716 |
| 0.7145833333333332 | 114.716 |
| 0.7152777777777778 | 110.201 |
| 0.7159722222222222 | 110.201 |
| 0.7166666666666667 | 110.201 |
| 0.717361111111111 | 110.201 |
| 0.7180555555555556 | 110.201 |
| 0.71875 | 110.201 |
| 0.7194444444444444 | 110.201 |
| 0.720138888888889 | 110.201 |
| 0.7208333333333333 | 110.201 |
| 0.7215277777777778 | 114.716 |
| 0.7222222222222222 | 114.716 |
| 0.7229166666666668 | 110.201 |
| 0.7236111111111111 | 83.205 |
| 0.7243055555555555 | 83.205 |
| 0.725 | 96.682 |
| 0.7256944444444445 | 123.758 |
| 0.7263888888888889 | 128.284 |
| 0.7270833333333333 | 123.758 |
| 0.7277777777777777 | 114.716 |
| 0.7284722222222223 | 101.184 |
| 0.7291666666666666 | 123.758 |
| 0.7298611111111111 | 128.284 |
| 0.7305555555555556 | 123.758 |
| 0.7312500000000001 | 119.235 |
| 0.7319444444444444 | 105.69 |
| 0.7326388888888888 | 105.69 |
| 0.7333333333333334 | 83.205 |
| 0.7340277777777778 | 87.692 |
| 0.7347222222222222 | 114.716 |
| 0.7354166666666666 | 128.284 |
| 0.7361111111111112 | 132.814 |
| 0.7368055555555556 | 128.284 |
| 0.7374999999999999 | 132.814 |
| 0.7381944444444444 | 132.814 |
| 0.7388888888888889 | 128.284 |
| 0.7395833333333334 | 128.284 |
| 0.7402777777777777 | 123.758 |
| 0.7409722222222223 | 114.716 |
| 0.7416666666666667 | 110.201 |
| 0.7423611111111111 | 105.69 |
| 0.7430555555555555 | 101.184 |
| 0.74375 | 96.682 |
| 0.7444444444444445 | 92.184 |
| 0.7451388888888889 | 92.184 |
| 0.7458333333333332 | 83.205 |
| 0.7465277777777778 | 78.722 |
| 0.7472222222222222 | 87.692 |
| 0.7479166666666667 | 87.692 |
| 0.748611111111111 | 92.184 |
| 0.7493055555555556 | 92.184 |
| 0.75 | 96.682 |
| 0.7506944444444444 | 92.184 |
| 0.751388888888889 | 87.692 |
| 0.7520833333333333 | 96.682 |
| 0.7527777777777778 | 101.184 |
| 0.7534722222222222 | 101.184 |
| 0.7541666666666668 | 105.69 |
| 0.7548611111111111 | 105.69 |
| 0.7555555555555555 | 105.69 |
| 0.75625 | 110.201 |
| 0.7569444444444445 | 105.69 |
| 0.7576388888888889 | 101.184 |
| 0.7583333333333333 | 96.682 |
| 0.7590277777777777 | 96.682 |
| 0.7597222222222223 | 96.682 |
| 0.7604166666666666 | 87.692 |
| 0.7611111111111111 | 83.205 |
| 0.7618055555555556 | 83.205 |
| 0.7625000000000001 | 83.205 |
| 0.7631944444444444 | 83.205 |
| 0.7638888888888888 | 83.205 |
| 0.7645833333333334 | 78.722 |
| 0.7652777777777778 | 78.722 |
| 0.7659722222222222 | 74.246 |
| 0.7666666666666666 | 65.31 |
| 0.7673611111111112 | 65.31 |
| 0.7680555555555556 | 65.31 |
| 0.7687499999999999 | 65.31 |
| 0.7694444444444444 | 60.85 |
| 0.7701388888888889 | 47.511 |
| 0.7708333333333334 | 47.511 |
| 0.7715277777777777 | 51.951 |
| 0.7722222222222223 | 51.951 |
| 0.7729166666666667 | 43.079 |
| 0.7736111111111111 | 47.511 |
| 0.7743055555555555 | 43.079 |
| 0.775 | 47.511 |
| 0.7756944444444445 | 51.951 |
| 0.7763888888888889 | 47.511 |
| 0.7770833333333332 | 51.951 |
| 0.7777777777777778 | 47.511 |
| 0.7784722222222222 | 47.511 |
| 0.7791666666666667 | 51.951 |
| 0.779861111111111 | 47.511 |
| 0.7805555555555556 | 51.951 |
| 0.78125 | 51.951 |
| 0.7819444444444444 | 51.951 |
| 0.782638888888889 | 51.951 |
| 0.7833333333333333 | 51.951 |
| 0.7840277777777778 | 51.951 |
| 0.7847222222222222 | 47.511 |
| 0.7854166666666668 | 47.511 |
| 0.7861111111111111 | 43.079 |
| 0.7868055555555555 | 43.079 |
| 0.7875 | 43.079 |
| 0.7881944444444445 | 38.653 |
| 0.7888888888888889 | 34.234 |
| 0.7895833333333333 | 38.653 |
| 0.7902777777777777 | 38.653 |
| 0.7909722222222223 | 38.653 |
| 0.7916666666666666 | 38.653 |
| 0.7923611111111111 | 34.234 |
| 0.7930555555555556 | 34.234 |
| 0.7937500000000001 | 34.234 |
| 0.7944444444444444 | 38.653 |
| 0.7951388888888888 | 38.653 |
| 0.7958333333333334 | 34.234 |
| 0.7965277777777778 | 38.653 |
| 0.7972222222222222 | 38.653 |
| 0.7979166666666666 | 38.653 |
| 0.7986111111111112 | 38.653 |
| 0.7993055555555556 | 38.653 |
| 0.7999999999999999 | 38.653 |
| 0.8006944444444444 | 34.234 |
| 0.8013888888888889 | 34.234 |
| 0.8020833333333334 | 34.234 |
| 0.8027777777777777 | 34.234 |
| 0.8034722222222223 | 34.234 |
| 0.8041666666666667 | 29.823 |
| 0.8048611111111111 | 29.823 |
| 0.8055555555555555 | 29.823 |
| 0.80625 | 29.823 |
| 0.8069444444444445 | 29.823 |
| 0.8076388888888889 | 29.823 |
| 0.8083333333333332 | 25.419 |
| 0.8090277777777778 | 29.823 |
| 0.8097222222222222 | 21.024 |
| 0.8104166666666667 | 21.024 |
| 0.811111111111111 | 21.024 |
| 0.8118055555555556 | 25.419 |
| 0.8125 | 21.024 |
| 0.8131944444444444 | 21.024 |
| 0.813888888888889 | 21.024 |
| 0.8145833333333333 | 16.636 |
| 0.8152777777777778 | 16.636 |
| 0.8159722222222222 | 16.636 |
| 0.8166666666666668 | 16.636 |
| 0.8173611111111111 | 16.636 |
| 0.8180555555555555 | 16.636 |
| 0.81875 | 16.636 |
| 0.8194444444444445 | 16.636 |
| 0.8201388888888889 | 12.257 |
| 0.8208333333333333 | 16.636 |
| 0.8215277777777777 | 12.257 |
| 0.8222222222222223 | 12.257 |
| 0.8229166666666666 | 12.257 |
| 0.8236111111111111 | 12.257 |
| 0.8243055555555556 | 12.257 |
| 0.8250000000000001 | 12.257 |
| 0.8256944444444444 | 12.257 |
| 0.8263888888888888 | 12.257 |
| 0.8270833333333334 | 12.257 |
| 0.8277777777777778 | 12.257 |
| 0.8284722222222222 | 12.257 |
| 0.8291666666666666 | 12.257 |
| 0.8298611111111112 | 12.257 |
| 0.8305555555555556 | 12.257 |
| 0.8312499999999999 | 12.257 |
| 0.8319444444444444 | 12.257 |
| 0.8326388888888889 | 12.257 |
| 0.8333333333333334 | 12.257 |
| 0.8340277777777777 | 12.257 |
| 0.8347222222222223 | 12.257 |
| 0.8354166666666667 | 12.257 |
| 0.8361111111111111 | 12.257 |
| 0.8368055555555555 | 12.257 |
| 0.8375 | 12.257 |
| 0.8381944444444445 | 12.257 |
| 0.8388888888888889 | 12.257 |
| 0.8395833333333332 | 12.257 |
| 0.8402777777777778 | 12.257 |
| 0.8409722222222222 | 12.257 |
| 0.8416666666666667 | 12.257 |
| 0.842361111111111 | 12.257 |
| 0.8430555555555556 | 7.887 |
| 0.84375 | 7.887 |
| 0.8444444444444444 | 7.887 |
| 0.845138888888889 | 7.887 |
| 0.8458333333333333 | 3.525 |
| 0.8465277777777778 | 3.525 |
| 0.8472222222222222 | 3.525 |
| 0.8479166666666668 | 3.525 |
| 0.8486111111111111 | 3.525 |
| 0.8493055555555555 | 3.525 |
| 0.85 | 0 |
| 0.8506944444444445 | 0 |
| 0.8513888888888889 | 0 |
| 0.8520833333333333 | 0 |
| 0.8527777777777777 | 0 |
| 0.8534722222222223 | 0 |
| 0.8541666666666666 | 0 |
| 0.8548611111111111 | 0 |
| 0.8555555555555556 | 0 |
| 0.8562500000000001 | 0 |
| 0.8569444444444444 | 0 |
| 0.8576388888888888 | 0 |
| 0.8583333333333334 | 0 |
| 0.8590277777777778 | 0 |
| 0.8597222222222222 | 0 |
| 0.8604166666666666 | 0 |
| 0.8611111111111112 | 0 |
| 0.8618055555555556 | 0 |
| 0.8624999999999999 | 0 |
| 0.8631944444444444 | 0 |
| 0.8638888888888889 | 0 |
| 0.8645833333333334 | 0 |
| 0.8652777777777777 | 0 |
| 0.8659722222222223 | 0 |
| 0.8666666666666667 | 0 |
| 0.8673611111111111 | 0 |
| 0.8680555555555555 | 0 |
| 0.86875 | 0 |
| 0.8694444444444445 | 0 |
| 0.8701388888888889 | 0 |
| 0.8708333333333332 | 0 |
| 0.8715277777777778 | 0 |
| 0.8722222222222222 | 0 |
| 0.8729166666666667 | 0 |
| 0.873611111111111 | 0 |
| 0.8743055555555556 | 0 |
| 0.875 | 0 |
| 0.8756944444444444 | 0 |
| 0.876388888888889 | 0 |
| 0.8770833333333333 | 0 |
| 0.8777777777777778 | 0 |
| 0.8784722222222222 | 0 |
| 0.8791666666666668 | 0 |
| 0.8798611111111111 | 0 |
| 0.8805555555555555 | 0 |
| 0.88125 | 0 |
| 0.8819444444444445 | 0 |
| 0.8826388888888889 | 0 |
| 0.8833333333333333 | 0 |
| 0.8840277777777777 | 0 |
| 0.8847222222222223 | 0 |
| 0.8854166666666666 | 0 |
| 0.8861111111111111 | 0 |
| 0.8868055555555556 | 0 |
| 0.8875000000000001 | 0 |
| 0.8881944444444444 | 0 |
| 0.8888888888888888 | 0 |
| 0.8895833333333334 | 0 |
| 0.8902777777777778 | 0 |
| 0.8909722222222222 | 0 |
| 0.8916666666666666 | 0 |
| 0.8923611111111112 | 0 |
| 0.8930555555555556 | 0 |
| 0.8937499999999999 | 0 |
| 0.8944444444444444 | 0 |
| 0.8951388888888889 | 0 |
| 0.8958333333333334 | 0 |
| 0.8965277777777777 | 0 |
| 0.8972222222222223 | 0 |
| 0.8979166666666667 | 0 |
| 0.8986111111111111 | 0 |
| 0.8993055555555555 | 0 |
| 0.9 | 0 |
| 0.9006944444444445 | 0 |
| 0.9013888888888889 | 0 |
| 0.9020833333333332 | 0 |
| 0.9027777777777778 | 0 |
| 0.9034722222222222 | 0 |
| 0.9041666666666667 | 0 |
| 0.904861111111111 | 0 |
| 0.9055555555555556 | 0 |
| 0.90625 | 0 |
| 0.9069444444444444 | 0 |
| 0.907638888888889 | 0 |
| 0.9083333333333333 | 0 |
| 0.9090277777777778 | 0 |
| 0.9097222222222222 | 0 |
| 0.9104166666666668 | 0 |
| 0.9111111111111111 | 0 |
| 0.9118055555555555 | 0 |
| 0.9125 | 0 |
| 0.9131944444444445 | 0 |
| 0.9138888888888889 | 0 |
| 0.9145833333333333 | 0 |
| 0.9152777777777777 | 0 |
| 0.9159722222222223 | 0 |
| 0.9166666666666666 | 0 |
| 0.9173611111111111 | 0 |
| 0.9180555555555556 | 0 |
| 0.9187500000000001 | 0 |
| 0.9194444444444444 | 0 |
| 0.9201388888888888 | 0 |
| 0.9208333333333334 | 0 |
| 0.9215277777777778 | 0 |
| 0.9222222222222222 | 0 |
| 0.9229166666666666 | 0 |
| 0.9236111111111112 | 0 |
| 0.9243055555555556 | 0 |
| 0.9249999999999999 | 0 |
| 0.9256944444444444 | 0 |
| 0.9263888888888889 | 0 |
| 0.9270833333333334 | 0 |
| 0.9277777777777777 | 0 |
| 0.9284722222222223 | 0 |
| 0.9291666666666667 | 0 |
| 0.9298611111111111 | 0 |
| 0.9305555555555555 | 0 |
| 0.93125 | 0 |
| 0.9319444444444445 | 0 |
| 0.9326388888888889 | 0 |
| 0.9333333333333332 | 0 |
| 0.9340277777777778 | 0 |
| 0.9347222222222222 | 0 |
| 0.9354166666666667 | 0 |
| 0.936111111111111 | 0 |
| 0.9368055555555556 | 0 |
| 0.9375 | 0 |
| 0.9381944444444444 | 0 |
| 0.938888888888889 | 0 |
| 0.9395833333333333 | 0 |
| 0.9402777777777778 | 0 |
| 0.9409722222222222 | 0 |
| 0.9416666666666668 | 0 |
| 0.9423611111111111 | 0 |
| 0.9430555555555555 | 0 |
| 0.94375 | 0 |
| 0.9444444444444445 | 0 |
| 0.9451388888888889 | 0 |
| 0.9458333333333333 | 0 |
| 0.9465277777777777 | 0 |
| 0.9472222222222223 | 0 |
| 0.9479166666666666 | 0 |
| 0.9486111111111111 | 0 |
| 0.9493055555555556 | 0 |
| 0.9500000000000001 | 0 |
| 0.9506944444444444 | 0 |
| 0.9513888888888888 | 0 |
| 0.9520833333333334 | 0 |
| 0.9527777777777778 | 0 |
| 0.9534722222222222 | 0 |
| 0.9541666666666666 | 0 |
| 0.9548611111111112 | 0 |
| 0.9555555555555556 | 0 |
| 0.9562499999999999 | 0 |
| 0.9569444444444444 | 0 |
| 0.9576388888888889 | 0 |
| 0.9583333333333334 | 0 |
| 0.9590277777777777 | 0 |
| 0.9597222222222223 | 0 |
| 0.9604166666666667 | 0 |
| 0.9611111111111111 | 0 |
| 0.9618055555555555 | 0 |
| 0.9625 | 0 |
| 0.9631944444444445 | 0 |
| 0.9638888888888889 | 0 |
| 0.9645833333333332 | 0 |
| 0.9652777777777778 | 0 |
| 0.9659722222222222 | 0 |
| 0.9666666666666667 | 0 |
| 0.967361111111111 | 0 |
| 0.9680555555555556 | 0 |
| 0.96875 | 0 |
| 0.9694444444444444 | 0 |
| 0.970138888888889 | 0 |
| 0.9708333333333333 | 0 |
| 0.9715277777777778 | 0 |
| 0.9722222222222222 | 0 |
| 0.9729166666666668 | 0 |
| 0.9736111111111111 | 0 |
| 0.9743055555555555 | 0 |
| 0.975 | 0 |
| 0.9756944444444445 | 0 |
| 0.9763888888888889 | 0 |
| 0.9770833333333333 | 0 |
| 0.9777777777777777 | 0 |
| 0.9784722222222223 | 0 |
| 0.9791666666666666 | 0 |
| 0.9798611111111111 | 0 |
| 0.9805555555555556 | 0 |
| 0.9812500000000001 | 0 |
| 0.9819444444444444 | 0 |
| 0.9826388888888888 | 0 |
| 0.9833333333333334 | 0 |
| 0.9840277777777778 | 0 |
| 0.9847222222222222 | 0 |
| 0.9854166666666666 | 0 |
| 0.9861111111111112 | 0 |
| 0.9868055555555556 | 0 |
| 0.9874999999999999 | 0 |
| 0.9881944444444444 | 0 |
| 0.9888888888888889 | 0 |
| 0.9895833333333334 | 0 |
| 0.9902777777777777 | 0 |
| 0.9909722222222223 | 0 |
| 0.9916666666666667 | 0 |
| 0.9923611111111111 | 0 |
| 0.9930555555555555 | 0 |
| 0.99375 | 0 |
| 0.9944444444444445 | 0 |
| 0.9951388888888889 | 0 |
| 0.9958333333333332 | 0 |
| 0.9965277777777778 | 0 |
| 0.9972222222222222 | 0 |
| 0.9979166666666667 | 0 |
| 0.998611111111111 | 0 |
| 0.9993055555555556 | 0 |